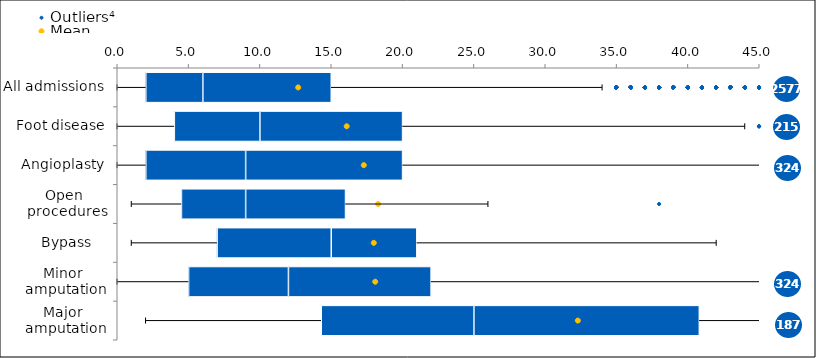
| Category | Lower Quartile | Median - Lower Quartile | Upper Quartile - Median |
|---|---|---|---|
| All admissions | 2 | 4 | 9 |
| Foot disease | 4 | 6 | 10 |
| Angioplasty | 2 | 7 | 11 |
| Open 
procedures | 4.5 | 4.5 | 7 |
| Bypass    | 7 | 8 | 6 |
| Minor 
amputation | 5 | 7 | 10 |
| Major 
amputation | 14.3 | 10.7 | 15.8 |